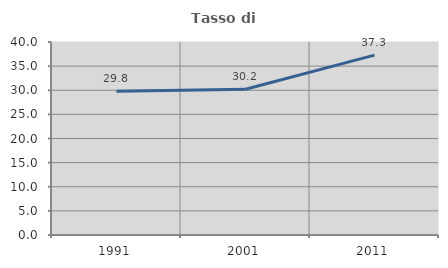
| Category | Tasso di occupazione   |
|---|---|
| 1991.0 | 29.814 |
| 2001.0 | 30.214 |
| 2011.0 | 37.272 |